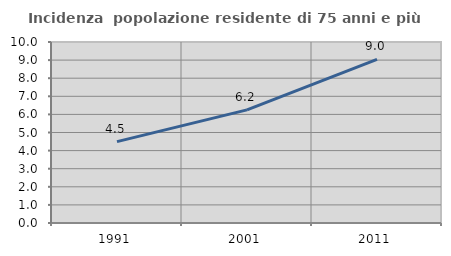
| Category | Incidenza  popolazione residente di 75 anni e più |
|---|---|
| 1991.0 | 4.496 |
| 2001.0 | 6.248 |
| 2011.0 | 9.041 |